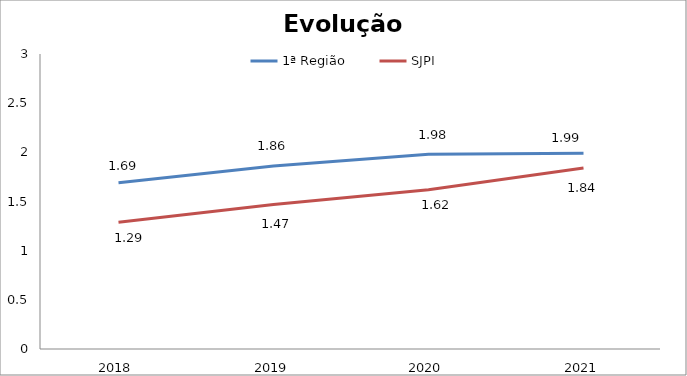
| Category | 1ª Região | SJPI |
|---|---|---|
| 0 | 1.69 | 1.29 |
| 1 | 1.86 | 1.47 |
| 2 | 1.98 | 1.62 |
| 3 | 1.99 | 1.84 |